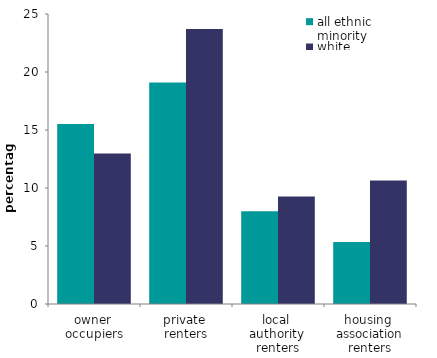
| Category | all ethnic 
minority | white |
|---|---|---|
| owner 
occupiers | 15.51 | 12.965 |
| private 
renters | 19.095 | 23.714 |
| local 
authority 
renters | 7.999 | 9.275 |
| housing 
association renters | 5.337 | 10.656 |